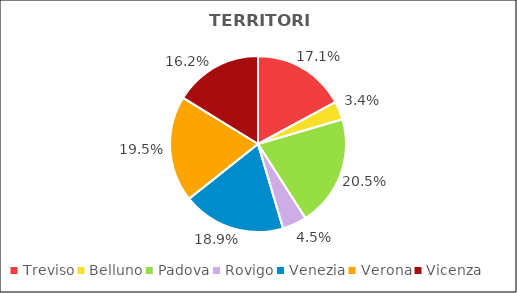
| Category | Series 0 |
|---|---|
| Treviso | 56601 |
| Belluno | 11151 |
| Padova | 67772 |
| Rovigo | 14790 |
| Venezia | 62607 |
| Verona | 64476 |
| Vicenza | 53664 |